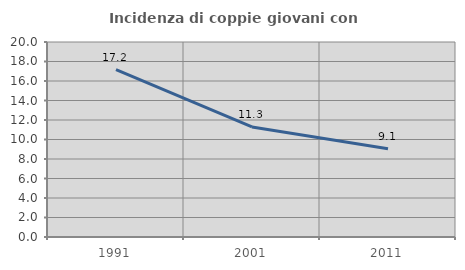
| Category | Incidenza di coppie giovani con figli |
|---|---|
| 1991.0 | 17.163 |
| 2001.0 | 11.284 |
| 2011.0 | 9.061 |